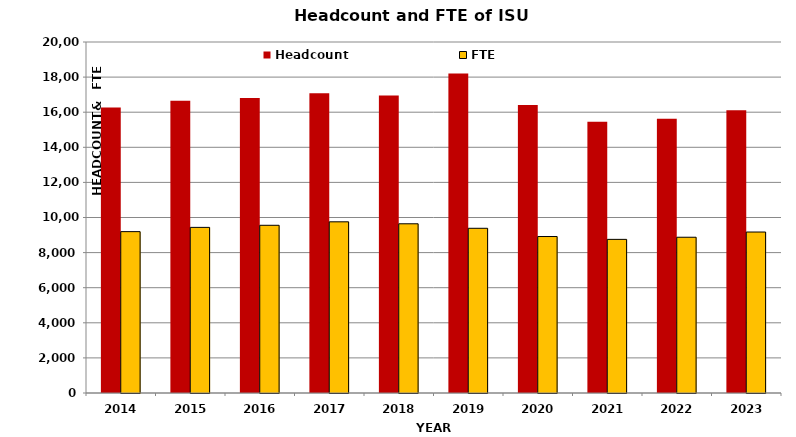
| Category | Headcount | FTE |
|---|---|---|
| 2014.0 | 16268 | 9195.13 |
| 2015.0 | 16647 | 9437.01 |
| 2016.0 | 16811 | 9556 |
| 2017.0 | 17075 | 9754 |
| 2018.0 | 16952 | 9642 |
| 2019.0 | 18212 | 9385 |
| 2020.0 | 16413 | 8916 |
| 2021.0 | 15456 | 8754 |
| 2022.0 | 15624 | 8875 |
| 2023.0 | 16116 | 9172.086 |